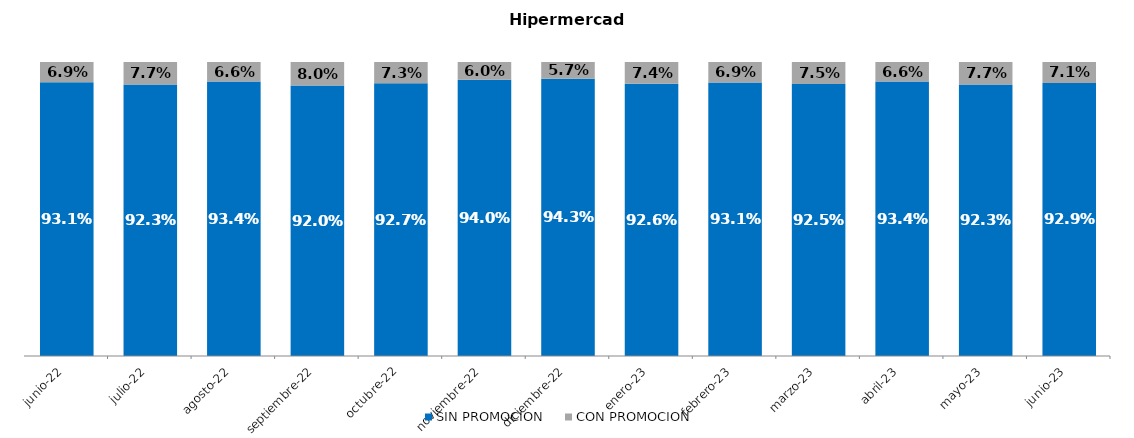
| Category | SIN PROMOCION   | CON PROMOCION   |
|---|---|---|
| 2022-06-01 | 0.931 | 0.069 |
| 2022-07-01 | 0.923 | 0.077 |
| 2022-08-01 | 0.934 | 0.066 |
| 2022-09-01 | 0.92 | 0.08 |
| 2022-10-01 | 0.927 | 0.073 |
| 2022-11-01 | 0.94 | 0.06 |
| 2022-12-01 | 0.943 | 0.057 |
| 2023-01-01 | 0.926 | 0.074 |
| 2023-02-01 | 0.931 | 0.069 |
| 2023-03-01 | 0.925 | 0.075 |
| 2023-04-01 | 0.934 | 0.066 |
| 2023-05-01 | 0.923 | 0.077 |
| 2023-06-01 | 0.929 | 0.071 |